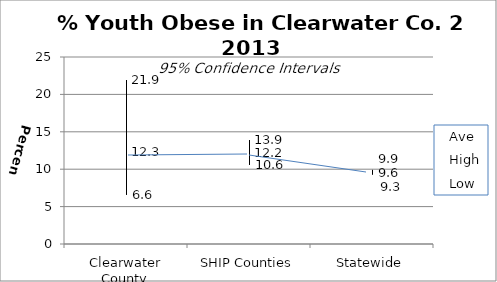
| Category | Ave | High | Low |
|---|---|---|---|
| Clearwater County | 12.3 | 21.9 | 6.6 |
| SHIP Counties | 12.2 | 13.9 | 10.6 |
| Statewide | 9.6 | 9.9 | 9.3 |